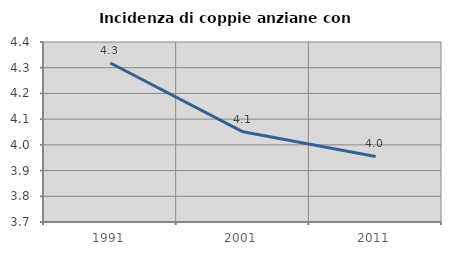
| Category | Incidenza di coppie anziane con figli |
|---|---|
| 1991.0 | 4.318 |
| 2001.0 | 4.051 |
| 2011.0 | 3.955 |